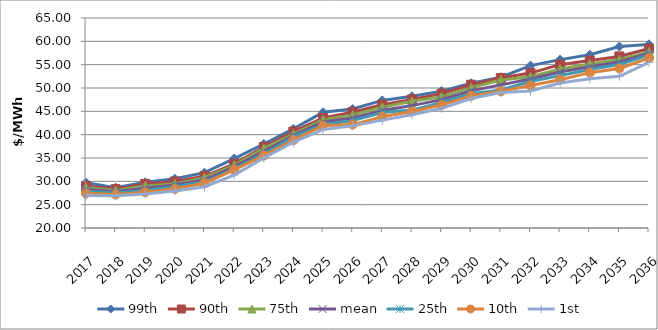
| Category | 99th | 90th | 75th | mean | 25th | 10th | 1st |
|---|---|---|---|---|---|---|---|
| 2017.0 | 29.705 | 28.997 | 28.633 | 28.272 | 27.884 | 27.425 | 26.984 |
| 2018.0 | 28.652 | 28.325 | 28.018 | 27.761 | 27.518 | 27.175 | 26.9 |
| 2019.0 | 29.791 | 29.446 | 29.012 | 28.506 | 28.057 | 27.668 | 27.278 |
| 2020.0 | 30.537 | 29.953 | 29.439 | 29.205 | 28.892 | 28.402 | 27.949 |
| 2021.0 | 31.863 | 31.086 | 30.776 | 30.298 | 29.851 | 29.592 | 28.841 |
| 2022.0 | 34.875 | 33.754 | 33.423 | 33.091 | 32.678 | 32.457 | 31.344 |
| 2023.0 | 38.003 | 37.351 | 37.061 | 36.447 | 35.813 | 35.521 | 34.989 |
| 2024.0 | 41.233 | 40.658 | 40.107 | 39.799 | 39.529 | 38.839 | 38.402 |
| 2025.0 | 44.798 | 43.576 | 43.204 | 42.713 | 42.126 | 41.914 | 41.081 |
| 2026.0 | 45.487 | 44.831 | 44.21 | 43.568 | 43.012 | 42.16 | 41.888 |
| 2027.0 | 47.341 | 46.427 | 45.894 | 45.194 | 44.741 | 43.837 | 43.114 |
| 2028.0 | 48.215 | 47.539 | 47.14 | 46.227 | 45.267 | 44.969 | 44.281 |
| 2029.0 | 49.335 | 48.797 | 48.122 | 47.503 | 46.899 | 46.369 | 45.628 |
| 2030.0 | 51.011 | 50.704 | 50.084 | 49.407 | 48.787 | 48.313 | 47.748 |
| 2031.0 | 52.311 | 52.137 | 51.727 | 50.664 | 49.599 | 49.295 | 49.041 |
| 2032.0 | 54.805 | 53.198 | 52.401 | 51.943 | 51.401 | 50.534 | 49.373 |
| 2033.0 | 56.08 | 55 | 54.07 | 53.424 | 52.654 | 51.757 | 51.072 |
| 2034.0 | 57.128 | 55.87 | 55.136 | 54.548 | 53.964 | 53.29 | 51.974 |
| 2035.0 | 58.892 | 56.769 | 56.116 | 55.572 | 55.019 | 54.18 | 52.511 |
| 2036.0 | 59.363 | 58.432 | 57.725 | 57.438 | 57.05 | 56.393 | 55.484 |